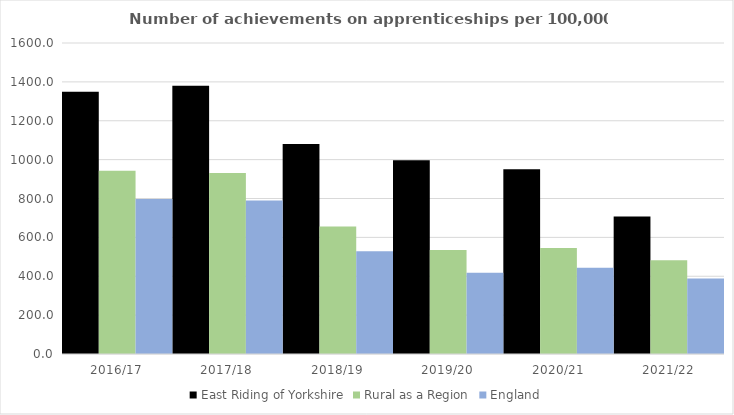
| Category | East Riding of Yorkshire | Rural as a Region | England |
|---|---|---|---|
| 2016/17 | 1349 | 942.594 | 797 |
| 2017/18 | 1380 | 931.709 | 790 |
| 2018/19 | 1080 | 656.44 | 528 |
| 2019/20 | 997 | 535.552 | 418 |
| 2020/21 | 950 | 545.333 | 444 |
| 2021/22 | 708 | 482.936 | 389 |